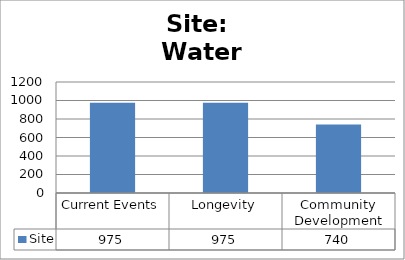
| Category | Site |
|---|---|
| Current Events | 975 |
| Longevity | 975 |
| Community Development | 740 |